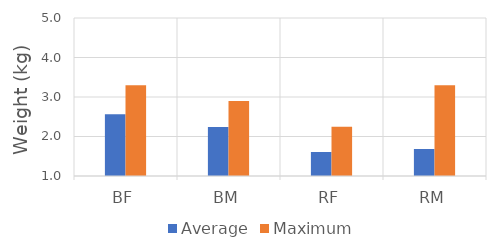
| Category | Average | Maximum |
|---|---|---|
| BF | 2.563 | 3.3 |
| BM | 2.238 | 2.9 |
| RF | 1.608 | 2.25 |
| RM | 1.683 | 3.3 |